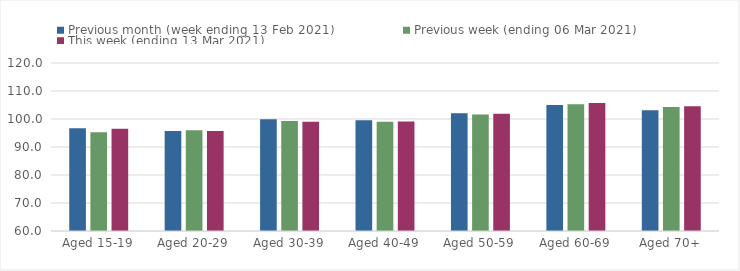
| Category | Previous month (week ending 13 Feb 2021) | Previous week (ending 06 Mar 2021) | This week (ending 13 Mar 2021) |
|---|---|---|---|
| Aged 15-19 | 96.69 | 95.3 | 96.49 |
| Aged 20-29 | 95.71 | 95.97 | 95.7 |
| Aged 30-39 | 99.91 | 99.31 | 99.06 |
| Aged 40-49 | 99.51 | 99.03 | 99.13 |
| Aged 50-59 | 102.04 | 101.63 | 101.88 |
| Aged 60-69 | 105.03 | 105.26 | 105.74 |
| Aged 70+ | 103.1 | 104.26 | 104.59 |